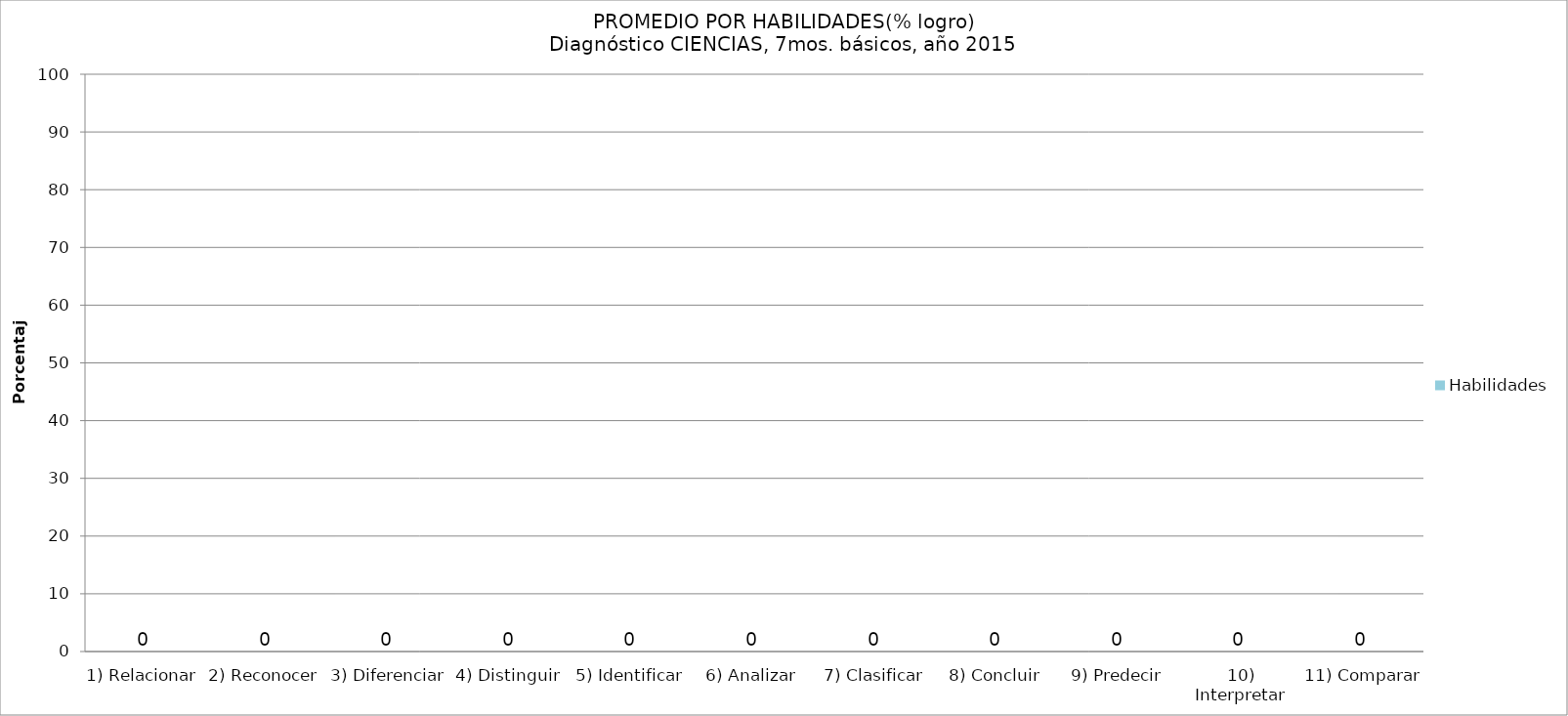
| Category | Habilidades |
|---|---|
| 1) Relacionar | 0 |
| 2) Reconocer | 0 |
| 3) Diferenciar | 0 |
| 4) Distinguir | 0 |
| 5) Identificar | 0 |
| 6) Analizar | 0 |
| 7) Clasificar | 0 |
| 8) Concluir | 0 |
| 9) Predecir | 0 |
| 10) Interpretar | 0 |
| 11) Comparar | 0 |